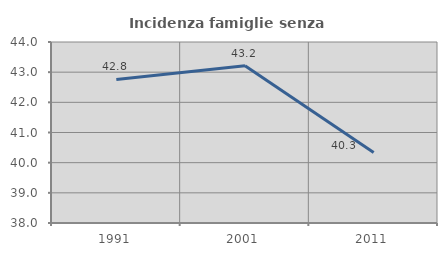
| Category | Incidenza famiglie senza nuclei |
|---|---|
| 1991.0 | 42.759 |
| 2001.0 | 43.215 |
| 2011.0 | 40.335 |